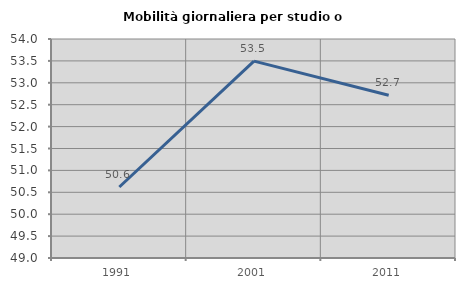
| Category | Mobilità giornaliera per studio o lavoro |
|---|---|
| 1991.0 | 50.621 |
| 2001.0 | 53.495 |
| 2011.0 | 52.716 |